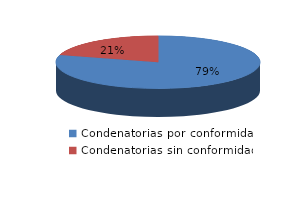
| Category | Series 0 |
|---|---|
| 0 | 54 |
| 1 | 14 |